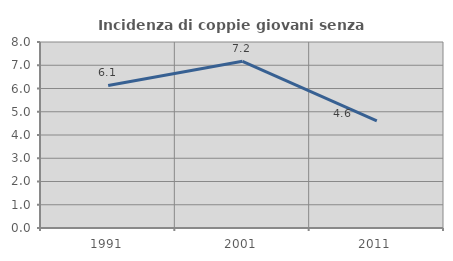
| Category | Incidenza di coppie giovani senza figli |
|---|---|
| 1991.0 | 6.131 |
| 2001.0 | 7.17 |
| 2011.0 | 4.612 |